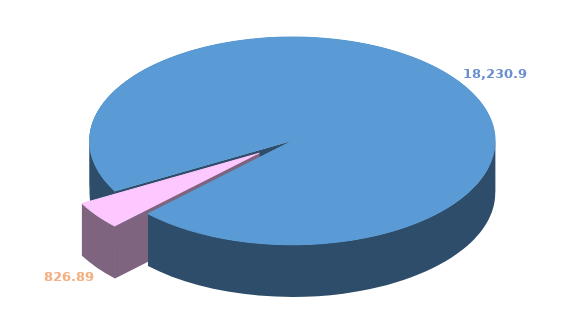
| Category | Series 0 |
|---|---|
| 0 | 18230.924 |
| 1 | 826.893 |